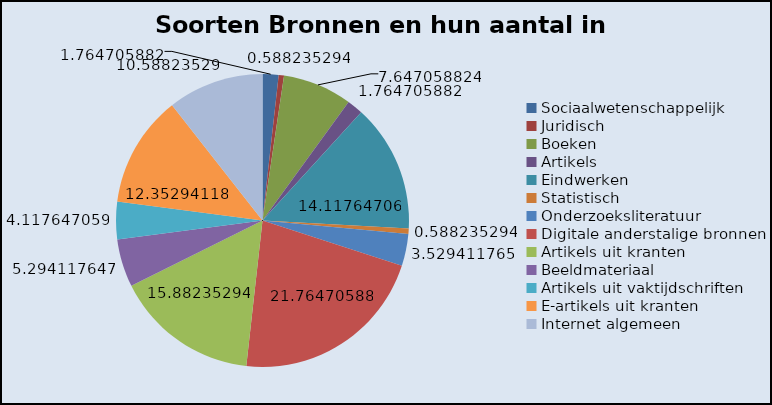
| Category | Series 0 |
|---|---|
| Sociaalwetenschappelijk  | 1.765 |
| Juridisch | 0.588 |
| Boeken | 7.647 |
| Artikels | 1.765 |
| Eindwerken | 14.118 |
| Statistisch | 0.588 |
| Onderzoeksliteratuur | 3.529 |
| Digitale anderstalige bronnen | 21.765 |
| Artikels uit kranten | 15.882 |
| Beeldmateriaal  | 5.294 |
| Artikels uit vaktijdschriften | 4.118 |
| E-artikels uit kranten | 12.353 |
| Internet algemeen  | 10.588 |